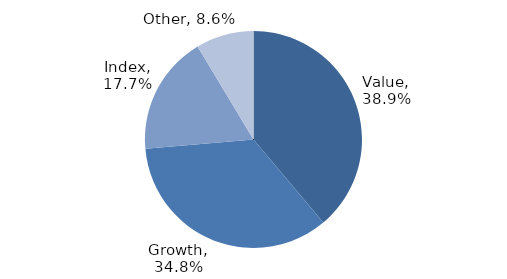
| Category | Investment Style |
|---|---|
| Value | 0.389 |
| Growth | 0.348 |
| Index | 0.177 |
| Other | 0.086 |